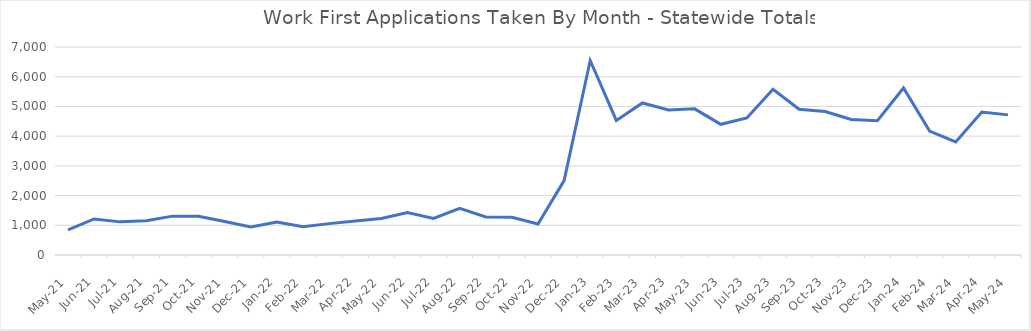
| Category | Series 0 |
|---|---|
| 2024-05-24 | 4716 |
| 2024-04-24 | 4813 |
| 2024-03-24 | 3803 |
| 2024-02-24 | 4172 |
| 2024-01-24 | 5621 |
| 2023-12-23 | 4519 |
| 2023-11-23 | 4563 |
| 2023-10-23 | 4827 |
| 2023-09-23 | 4905 |
| 2023-08-23 | 5577 |
| 2023-07-23 | 4613 |
| 2023-06-23 | 4398 |
| 2023-05-23 | 4918 |
| 2023-04-23 | 4882 |
| 2023-03-23 | 5117 |
| 2023-02-01 | 4530 |
| 2023-01-01 | 6546 |
| 2022-12-01 | 2505 |
| 2022-11-22 | 1044 |
| 2022-10-22 | 1268 |
| 2022-09-22 | 1279 |
| 2022-08-22 | 1568 |
| 2022-07-22 | 1228 |
| 2022-06-01 | 1433 |
| 2022-05-01 | 1230 |
| 2022-04-01 | 1142 |
| 2022-03-01 | 1056 |
| 2022-02-01 | 953 |
| 2022-01-01 | 1113 |
| 2021-12-02 | 940 |
| 2021-11-01 | 1127 |
| 2021-10-01 | 1301 |
| 2021-09-01 | 1308 |
| 2021-08-01 | 1156 |
| 2021-07-01 | 1115 |
| 2021-06-01 | 1214 |
| 2021-05-01 | 845 |